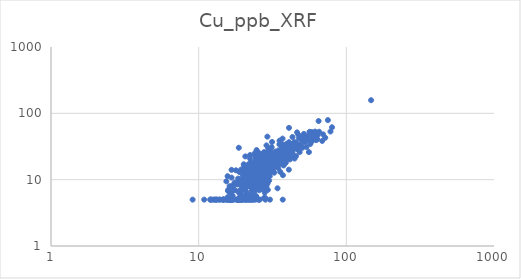
| Category | Cu_ppb_XRF |
|---|---|
| 27.5 | 13.859 |
| 18.4 | 5 |
| 23.8 | 8.054 |
| 20.7 | 5 |
| 30.4 | 13.428 |
| 29.3 | 18.657 |
| 28.5 | 15.938 |
| 18.8 | 5 |
| 24.2 | 15.489 |
| 42.4 | 34.415 |
| 34.7 | 16.87 |
| 29.2 | 11.066 |
| 39.7 | 22.91 |
| 23.6 | 9.479 |
| 37.2 | 20.809 |
| 33.1 | 26.563 |
| 31.8 | 23.556 |
| 48.1 | 32.991 |
| 35.5 | 17.676 |
| 29.4 | 20.763 |
| 27.1 | 7.229 |
| 23.8 | 7.392 |
| 29.2 | 21.963 |
| 23.8 | 14.417 |
| 28.4 | 13.94 |
| 40.8 | 29.378 |
| 37.2 | 11.681 |
| 28.3 | 11.213 |
| 27.6 | 16.207 |
| 36.4 | 20.574 |
| 33.8 | 20.212 |
| 17.0 | 5 |
| 29.8 | 18.769 |
| 25.8 | 12.161 |
| 68.6 | 38.376 |
| 63.8 | 46.55 |
| 61.4 | 53.082 |
| 46.7 | 32.158 |
| 44.6 | 20.815 |
| 19.7 | 5.548 |
| 63.8 | 49.867 |
| 36.7 | 17.306 |
| 33.9 | 24.291 |
| 18.2 | 5 |
| 25.6 | 7.629 |
| 12.8 | 5 |
| 32.9 | 16.752 |
| 26.3 | 11.844 |
| 60.5 | 49.882 |
| 20.7 | 5 |
| 15.0 | 5 |
| 22.0 | 11.431 |
| 25.5 | 8.741 |
| 23.0 | 7.203 |
| 32.6 | 19.04 |
| 20.3 | 16.383 |
| 31.9 | 13.617 |
| 40.4 | 28.215 |
| 34.1 | 19.54 |
| 28.7 | 12.289 |
| 28.3 | 11.625 |
| 37.5 | 16.748 |
| 18.9 | 12.989 |
| 28.4 | 14.241 |
| 12.6 | 5 |
| 15.9 | 6.783 |
| 22.8 | 16.077 |
| 31.2 | 30.922 |
| 18.2 | 5 |
| 16.4 | 5 |
| 32.0 | 22.095 |
| 10.9 | 5 |
| 14.0 | 5 |
| 27.8 | 24.786 |
| 35.2 | 23.533 |
| 28.3 | 16.068 |
| 24.5 | 8.907 |
| 21.2 | 8.409 |
| 28.6 | 7.267 |
| 30.0 | 9.668 |
| 27.1 | 13.74 |
| 24.5 | 5.658 |
| 22.0 | 9.651 |
| 27.5 | 15.005 |
| 22.7 | 7.654 |
| 25.6 | 11.872 |
| 15.7 | 5.43 |
| 30.8 | 16.45 |
| 54.1 | 41.071 |
| 19.4 | 5 |
| 21.7 | 5 |
| 23.0 | 6.74 |
| 24.2 | 5 |
| 21.6 | 8.508 |
| 16.4 | 5 |
| 19.8 | 5 |
| 25.2 | 14.474 |
| 17.1 | 6.829 |
| 14.7 | 5 |
| 19.2 | 5 |
| 18.2 | 5 |
| 32.9 | 19.942 |
| 24.2 | 14.385 |
| 37.9 | 23.23 |
| 38.6 | 22.919 |
| 26.1 | 16.546 |
| 56.3 | 52.643 |
| 9.1 | 5 |
| 25.3 | 13.418 |
| 24.8 | 8.583 |
| 24.0 | 6.739 |
| 25.3 | 8.384 |
| 24.7 | 15.229 |
| 28.2 | 14.328 |
| 23.4 | 15.065 |
| 17.0 | 5.702 |
| 15.6 | 5 |
| 24.9 | 13.094 |
| 57.0 | 34.515 |
| 25.0 | 25.885 |
| 28.7 | 12.462 |
| 15.8 | 6.785 |
| 12.0 | 5 |
| 20.8 | 8.05 |
| 13.1 | 5 |
| 36.6 | 21.08 |
| 21.8 | 9.976 |
| 16.0 | 5 |
| 31.8 | 18.311 |
| 52.0 | 46.325 |
| 45.9 | 35.348 |
| 34.0 | 18.637 |
| 27.4 | 10.83 |
| 30.7 | 15.747 |
| 43.0 | 25.39 |
| 26.1 | 8.476 |
| 19.5 | 12.713 |
| 33.5 | 23.487 |
| 18.7 | 30.265 |
| 26.8 | 12.531 |
| 30.7 | 24.759 |
| 39.8 | 30.76 |
| 29.7 | 11.424 |
| 17.9 | 13.836 |
| 17.5 | 5 |
| 59.6 | 50.974 |
| 14.7 | 5 |
| 29.3 | 24.317 |
| 31.3 | 13.732 |
| 31.8 | 14.889 |
| 29.7 | 22.842 |
| 29.4 | 26.486 |
| 29.7 | 19.542 |
| 25.7 | 6.937 |
| 29.4 | 16.991 |
| 28.9 | 13.966 |
| 28.7 | 19 |
| 29.2 | 9.13 |
| 22.7 | 5 |
| 24.6 | 7.798 |
| 28.9 | 12.36 |
| 28.3 | 5.29 |
| 27.4 | 13.222 |
| 19.3 | 5.138 |
| 24.5 | 11.456 |
| 15.5 | 5 |
| 42.5 | 30.047 |
| 40.9 | 28.185 |
| 49.6 | 34.495 |
| 20.6 | 12.24 |
| 19.6 | 5 |
| 19.3 | 6.643 |
| 20.1 | 7.373 |
| 16.4 | 5 |
| 33.0 | 17.621 |
| 45.7 | 31.463 |
| 58.0 | 52.306 |
| 21.5 | 9.96 |
| 26.3 | 20.675 |
| 24.0 | 13.049 |
| 25.0 | 12.195 |
| 32.1 | 24.033 |
| 38.5 | 30.683 |
| 29.9 | 12.498 |
| 16.1 | 7.084 |
| 26.1 | 18.328 |
| 25.9 | 5 |
| 42.7 | 22.997 |
| 27.5 | 8.043 |
| 25.8 | 17.953 |
| 25.4 | 5 |
| 26.9 | 10.008 |
| 32.1 | 17.111 |
| 24.5 | 21.157 |
| 48.9 | 41.318 |
| 23.6 | 8.858 |
| 19.1 | 9.63 |
| 24.5 | 13.166 |
| 38.1 | 25.973 |
| 23.5 | 14.804 |
| 40.6 | 21.449 |
| 29.3 | 17.152 |
| 20.9 | 15.382 |
| 23.3 | 9.325 |
| 30.0 | 20.141 |
| 24.8 | 13.142 |
| 25.5 | 16.102 |
| 19.9 | 8.891 |
| 23.8 | 18.372 |
| 30.3 | 17.581 |
| 34.4 | 20.585 |
| 41.5 | 20.206 |
| 22.0 | 10.403 |
| 18.7 | 6.392 |
| 27.7 | 25.975 |
| 18.0 | 8.547 |
| 20.1 | 5.719 |
| 24.6 | 15.073 |
| 58.2 | 37.538 |
| 29.8 | 12.028 |
| 25.0 | 13.185 |
| 28.2 | 9.191 |
| 26.7 | 10.545 |
| 31.8 | 15.018 |
| 43.6 | 31.362 |
| 23.8 | 11.798 |
| 14.6 | 5 |
| 28.5 | 16.686 |
| 33.1 | 16.299 |
| 33.3 | 19.061 |
| 31.6 | 20.469 |
| 48.8 | 42.482 |
| 45.2 | 33.317 |
| 39.4 | 34.732 |
| 25.6 | 5 |
| 25.9 | 11.926 |
| 31.8 | 16.813 |
| 18.6 | 5 |
| 22.2 | 10.965 |
| 26.3 | 12.4 |
| 39.5 | 20.24 |
| 30.2 | 16.192 |
| 31.0 | 16.836 |
| 25.9 | 14.801 |
| 30.7 | 18.668 |
| 27.1 | 15.198 |
| 25.9 | 16.183 |
| 28.7 | 17.536 |
| 19.4 | 9.252 |
| 26.4 | 9.855 |
| 28.8 | 7.943 |
| 27.6 | 19.267 |
| 26.5 | 11.318 |
| 22.4 | 5.634 |
| 30.6 | 15.825 |
| 28.3 | 5 |
| 26.1 | 8.712 |
| 30.5 | 25.033 |
| 29.4 | 14.184 |
| 24.3 | 24.539 |
| 21.4 | 10.893 |
| 23.1 | 12.476 |
| 30.4 | 5 |
| 30.0 | 19.323 |
| 21.5 | 16.404 |
| 25.5 | 15.117 |
| 19.9 | 10.229 |
| 26.4 | 9.64 |
| 35.2 | 22.046 |
| 28.1 | 23.948 |
| 20.2 | 17.064 |
| 31.7 | 17.114 |
| 24.6 | 14.528 |
| 24.4 | 19.747 |
| 27.7 | 18.539 |
| 29.8 | 23.617 |
| 22.1 | 9.659 |
| 19.1 | 6.654 |
| 30.2 | 20.847 |
| 28.0 | 11.678 |
| 37.3 | 20.152 |
| 39.1 | 28.676 |
| 35.1 | 19.465 |
| 30.2 | 25.788 |
| 34.7 | 27.652 |
| 61.7 | 40.666 |
| 57.7 | 44.524 |
| 36.7 | 30.989 |
| 43.4 | 34.578 |
| 33.4 | 24.473 |
| 33.0 | 24.752 |
| 26.3 | 15.058 |
| 23.2 | 15.616 |
| 31.1 | 20.609 |
| 28.0 | 6.366 |
| 25.9 | 10.512 |
| 23.1 | 5.852 |
| 28.7 | 10.873 |
| 32.9 | 17.683 |
| 31.8 | 16.001 |
| 28.7 | 18.924 |
| 34.4 | 22.468 |
| 44.5 | 36.887 |
| 37.3 | 30.338 |
| 53.5 | 42.111 |
| 33.9 | 22.513 |
| 24.4 | 21.868 |
| 28.7 | 22.479 |
| 23.2 | 10.007 |
| 25.8 | 17.915 |
| 24.1 | 25.25 |
| 23.3 | 5 |
| 22.1 | 5 |
| 22.0 | 11.673 |
| 25.6 | 25.2 |
| 30.3 | 19.198 |
| 20.9 | 9.474 |
| 21.7 | 11.674 |
| 19.6 | 7.358 |
| 23.8 | 10.59 |
| 19.1 | 5.425 |
| 12.2 | 5 |
| 26.9 | 14.194 |
| 24.0 | 23.367 |
| 27.7 | 19.348 |
| 16.7 | 14.061 |
| 26.4 | 21.091 |
| 26.9 | 15.049 |
| 27.0 | 11.589 |
| 33.7 | 24.196 |
| 32.5 | 12.741 |
| 35.7 | 13.057 |
| 30.3 | 11.268 |
| 23.9 | 12.119 |
| 29.4 | 7.003 |
| 34.2 | 7.409 |
| 57.1 | 39.432 |
| 51.6 | 49.002 |
| 24.7 | 12.195 |
| 16.9 | 8.107 |
| 35.2 | 34.076 |
| 28.3 | 21.68 |
| 22.0 | 11.188 |
| 20.5 | 14.127 |
| 22.1 | 5 |
| 16.7 | 7.709 |
| 27.7 | 15.404 |
| 17.6 | 6.933 |
| 19.1 | 6.04 |
| 21.0 | 9.13 |
| 22.9 | 13.208 |
| 18.5 | 10.378 |
| 22.1 | 11.908 |
| 21.0 | 5 |
| 17.2 | 7.152 |
| 13.8 | 5 |
| 20.8 | 9.41 |
| 18.9 | 5 |
| 23.8 | 15.546 |
| 22.3 | 20.713 |
| 19.4 | 14.222 |
| 40.9 | 60.382 |
| 27.4 | 24.953 |
| 57.0 | 48.727 |
| 62.4 | 49.602 |
| 48.7 | 32.918 |
| 53.7 | 31.006 |
| 24.1 | 17.32 |
| 27.9 | 13.921 |
| 21.5 | 6.076 |
| 19.5 | 8.172 |
| 36.7 | 24.177 |
| 43.1 | 26.55 |
| 42.9 | 29.62 |
| 52.6 | 36.954 |
| 30.6 | 25.772 |
| 28.3 | 12.671 |
| 43.2 | 43.961 |
| 37.6 | 16.396 |
| 29.3 | 13.703 |
| 28.0 | 24.173 |
| 24.8 | 14.25 |
| 21.4 | 11.709 |
| 21.1 | 13.175 |
| 15.6 | 5 |
| 25.1 | 15.882 |
| 61.9 | 45.382 |
| 27.5 | 15.324 |
| 65.4 | 52.747 |
| 25.4 | 10.226 |
| 26.4 | 16.905 |
| 21.1 | 5.691 |
| 12.0 | 5 |
| 78.1 | 53.182 |
| 16.4 | 6.236 |
| 29.2 | 44.51 |
| 16.7 | 5 |
| 29.3 | 19.894 |
| 34.0 | 24.173 |
| 32.2 | 23.442 |
| 31.4 | 21.172 |
| 40.8 | 29.675 |
| 27.6 | 18.746 |
| 17.0 | 7.548 |
| 18.2 | 8.652 |
| 18.3 | 5 |
| 21.7 | 8.025 |
| 23.9 | 12.983 |
| 33.2 | 19.577 |
| 39.9 | 27.422 |
| 22.1 | 16.518 |
| 22.4 | 8.44 |
| 18.8 | 6.756 |
| 147.1 | 157.727 |
| 64.9 | 76.557 |
| 40.0 | 26.419 |
| 22.9 | 13.505 |
| 16.0 | 5 |
| 35.3 | 38.729 |
| 33.9 | 23.98 |
| 34.0 | 24.204 |
| 24.3 | 10.626 |
| 29.4 | 26.265 |
| 28.3 | 21.446 |
| 29.4 | 23.276 |
| 45.4 | 35.176 |
| 46.4 | 30.488 |
| 38.5 | 31.789 |
| 31.2 | 22.269 |
| 15.7 | 11.286 |
| 25.0 | 15.976 |
| 36.0 | 19.902 |
| 25.8 | 17.87 |
| 33.5 | 20.098 |
| 26.5 | 14.286 |
| 14.6 | 5 |
| 19.0 | 6.591 |
| 24.7 | 27.94 |
| 16.7 | 5 |
| 20.6 | 14.639 |
| 24.8 | 15.8 |
| 30.2 | 18.499 |
| 31.6 | 18.964 |
| 26.4 | 11.885 |
| 42.7 | 33.766 |
| 31.4 | 37.046 |
| 21.4 | 10.016 |
| 21.0 | 6.57 |
| 27.9 | 24.27 |
| 43.6 | 33.454 |
| 41.1 | 30.983 |
| 47.3 | 47.533 |
| 75.0 | 79.08 |
| 26.9 | 15.106 |
| 26.8 | 19.933 |
| 22.2 | 12.507 |
| 69.6 | 48.204 |
| 30.7 | 29.19 |
| 36.5 | 32.12 |
| 20.9 | 9.218 |
| 20.2 | 14.308 |
| 15.4 | 9.451 |
| 23.6 | 5 |
| 17.0 | 5 |
| 24.7 | 12.525 |
| 27.7 | 5.296 |
| 27.8 | 15.362 |
| 29.3 | 8.82 |
| 30.6 | 13.848 |
| 33.0 | 19.424 |
| 21.2 | 5 |
| 24.4 | 5.539 |
| 26.9 | 17.009 |
| 19.3 | 5 |
| 22.8 | 5 |
| 37.1 | 5 |
| 26.5 | 21.58 |
| 28.0 | 12.034 |
| 27.4 | 16.786 |
| 37.0 | 41.6 |
| 28.8 | 32.83 |
| 37.4 | 28.867 |
| 62.5 | 39.427 |
| 18.5 | 8.994 |
| 18.4 | 8.475 |
| 24.5 | 21.985 |
| 13.1 | 5 |
| 18.3 | 9.053 |
| 26.5 | 14.074 |
| 25.3 | 17.993 |
| 21.1 | 14.359 |
| 28.6 | 19.744 |
| 22.6 | 15.648 |
| 23.4 | 17.352 |
| 18.8 | 9.335 |
| 28.8 | 17.159 |
| 26.3 | 22.115 |
| 21.5 | 9.091 |
| 21.6 | 8.72 |
| 15.9 | 7.072 |
| 25.6 | 13.611 |
| 50.4 | 30.283 |
| 28.3 | 9.621 |
| 24.7 | 8.387 |
| 16.5 | 5 |
| 27.6 | 13.513 |
| 19.9 | 11.182 |
| 21.1 | 7.635 |
| 26.9 | 23.93 |
| 31.6 | 22.833 |
| 24.3 | 9.065 |
| 22.5 | 17.849 |
| 20.9 | 12.663 |
| 36.9 | 34.155 |
| 47.7 | 41.525 |
| 50.2 | 40.022 |
| 46.4 | 51.643 |
| 80.0 | 61.66 |
| 48.3 | 26.001 |
| 20.7 | 22.404 |
| 22.0 | 14.1 |
| 16.5 | 5 |
| 21.8 | 17.102 |
| 16.7 | 10.749 |
| 27.7 | 12.327 |
| 27.7 | 11.718 |
| 16.3 | 5 |
| 25.9 | 20.26 |
| 45.6 | 22.639 |
| 38.9 | 17.916 |
| 72.0 | 42.848 |
| 40.3 | 28.259 |
| 38.3 | 22.154 |
| 34.6 | 14.868 |
| 37.5 | 17.351 |
| 48.1 | 32.476 |
| 63.4 | 40.97 |
| 29.0 | 17.738 |
| 29.1 | 15.72 |
| 47.3 | 28.627 |
| 21.5 | 5.918 |
| 16.2 | 7.989 |
| 17.5 | 9.046 |
| 31.9 | 19.849 |
| 32.3 | 24.21 |
| 37.3 | 28.133 |
| 29.6 | 29.48 |
| 40.9 | 36.77 |
| 44.0 | 29.203 |
| 59.6 | 45.083 |
| 22.8 | 16.288 |
| 29.7 | 19.49 |
| 31.9 | 18.538 |
| 35.4 | 22.756 |
| 25.7 | 8.177 |
| 25.3 | 13.792 |
| 35.7 | 20.513 |
| 34.5 | 20.671 |
| 20.0 | 5 |
| 13.4 | 5 |
| 26.5 | 13.031 |
| 55.8 | 26.061 |
| 27.4 | 16.258 |
| 46.7 | 28.742 |
| 36.2 | 24.033 |
| 29.5 | 13.139 |
| 26.2 | 18.35 |
| 44.9 | 33.342 |
| 46.1 | 29.219 |
| 36.8 | 22.261 |
| 33.1 | 22.033 |
| 24.5 | 12.651 |
| 23.7 | 11.476 |
| 55.6 | 45.282 |
| 32.8 | 23.366 |
| 30.4 | 26.76 |
| 46.5 | 31.721 |
| 45.8 | 31.496 |
| 55.6 | 40.329 |
| 49.6 | 30.786 |
| 40.8 | 14.154 |
| 22.3 | 23.53 |
| 40.4 | 30.61 |
| 41.0 | 23.898 |
| 32.7 | 24.49 |
| 20.6 | 11.147 |
| 27.4 | 10.958 |
| 49.2 | 43.356 |
| 50.4 | 41.941 |
| 25.4 | 15.09 |